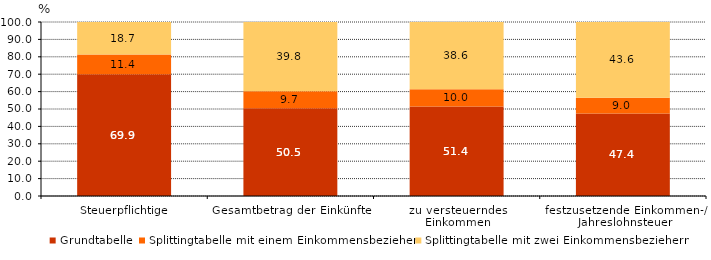
| Category | Grundtabelle | Splittingtabelle mit einem Einkommensbezieher | Splittingtabelle mit zwei Einkommensbeziehern |
|---|---|---|---|
| Steuerpflichtige | 69.9 | 11.4 | 18.7 |
| Gesamtbetrag der Einkünfte | 50.5 | 9.7 | 39.8 |
| zu versteuerndes 
Einkommen | 51.4 | 10 | 38.6 |
| festzusetzende Einkommen-/ Jahreslohnsteuer | 47.4 | 9 | 43.6 |